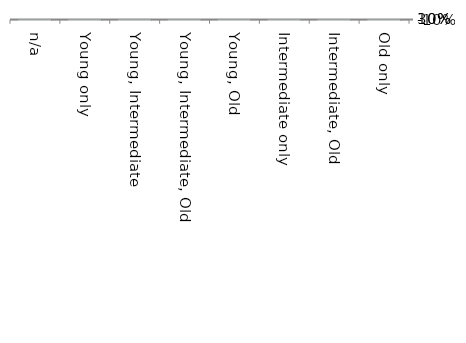
| Category | Near native & fragments |
|---|---|
| n/a | 0 |
| Young only | 0.003 |
| Young, Intermediate | 0.01 |
| Young, Intermediate, Old | 0.002 |
| Young, Old | 0 |
| Intermediate only | 0.003 |
| Intermediate, Old | 0.001 |
| Old only | 0 |